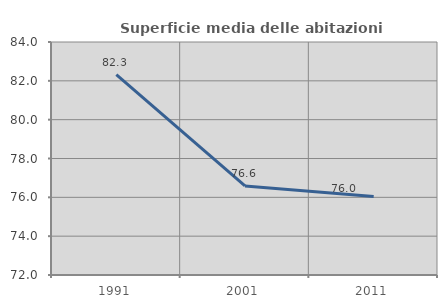
| Category | Superficie media delle abitazioni occupate |
|---|---|
| 1991.0 | 82.319 |
| 2001.0 | 76.584 |
| 2011.0 | 76.044 |